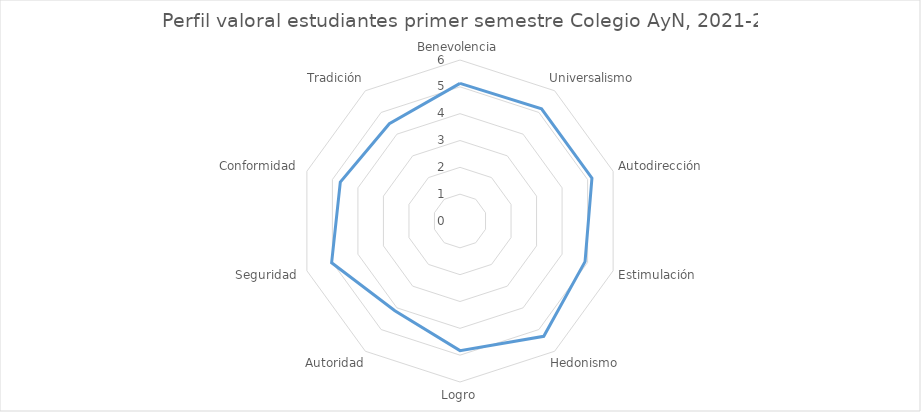
| Category | Series 0 |
|---|---|
| Benevolencia | 5.13 |
| Universalismo | 5.17 |
| Autodirección | 5.17 |
| Estimulación | 4.9 |
| Hedonismo | 5.31 |
| Logro | 4.83 |
| Autoridad | 4.13 |
| Seguridad | 5.03 |
| Conformidad | 4.69 |
| Tradición | 4.48 |